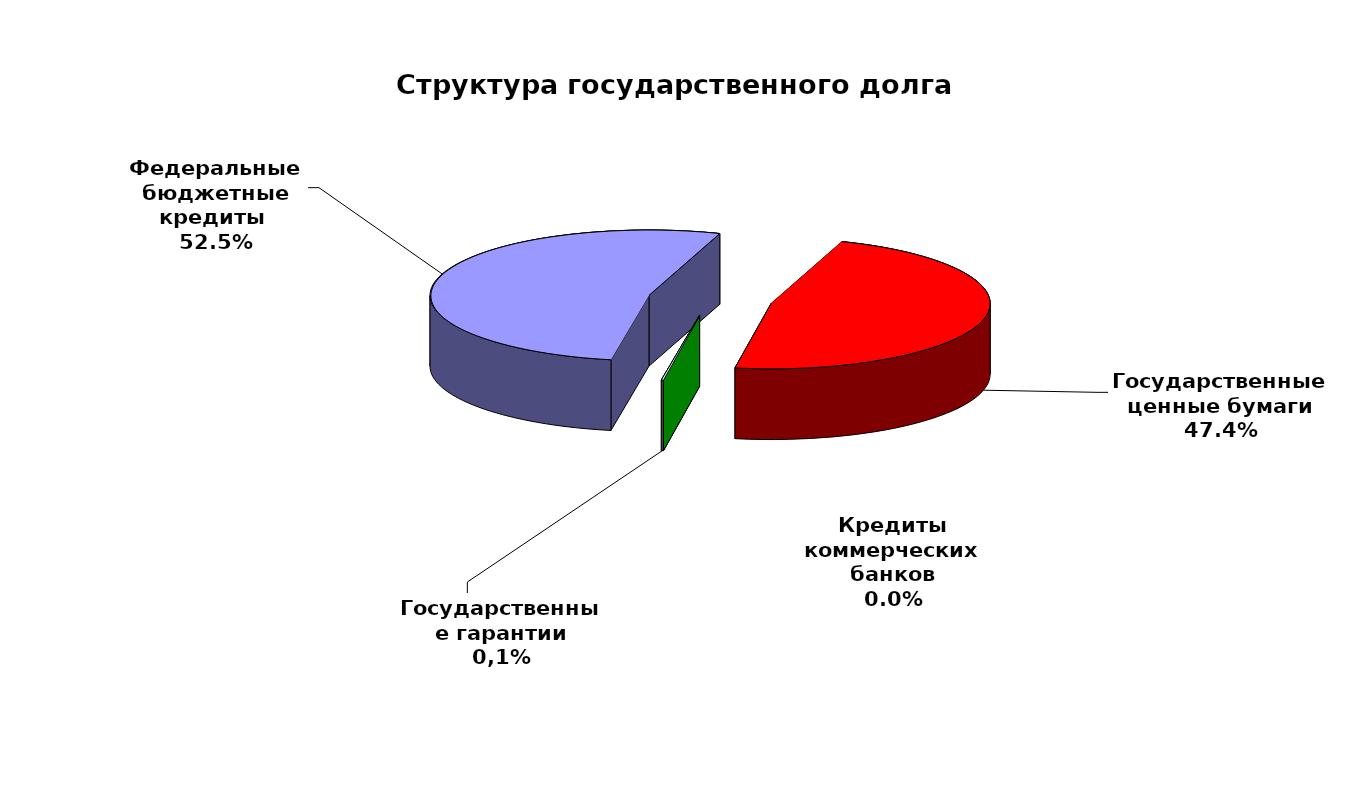
| Category | Series 0 |
|---|---|
| Федеральные бюджетные кредиты  | 54900618.713 |
| Государственные ценные бумаги | 49600000 |
| Кредиты коммерческих банков | 0 |
| Государственные гарантии | 141570.67 |